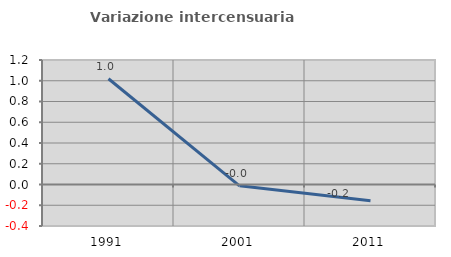
| Category | Variazione intercensuaria annua |
|---|---|
| 1991.0 | 1.019 |
| 2001.0 | -0.012 |
| 2011.0 | -0.156 |